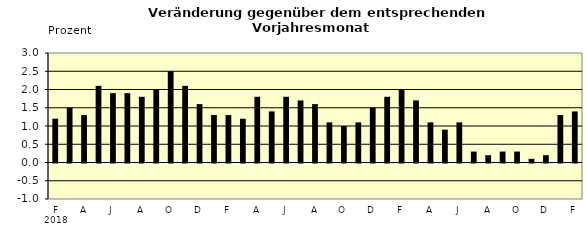
| Category | Series 0 |
|---|---|
| 0 | 1.2 |
| 1 | 1.5 |
| 2 | 1.3 |
| 3 | 2.1 |
| 4 | 1.9 |
| 5 | 1.9 |
| 6 | 1.8 |
| 7 | 2 |
| 8 | 2.5 |
| 9 | 2.1 |
| 10 | 1.6 |
| 11 | 1.3 |
| 12 | 1.3 |
| 13 | 1.2 |
| 14 | 1.8 |
| 15 | 1.4 |
| 16 | 1.8 |
| 17 | 1.7 |
| 18 | 1.6 |
| 19 | 1.1 |
| 20 | 1 |
| 21 | 1.1 |
| 22 | 1.5 |
| 23 | 1.8 |
| 24 | 2 |
| 25 | 1.7 |
| 26 | 1.1 |
| 27 | 0.9 |
| 28 | 1.1 |
| 29 | 0.3 |
| 30 | 0.2 |
| 31 | 0.3 |
| 32 | 0.3 |
| 33 | 0.1 |
| 34 | 0.2 |
| 35 | 1.3 |
| 36 | 1.4 |